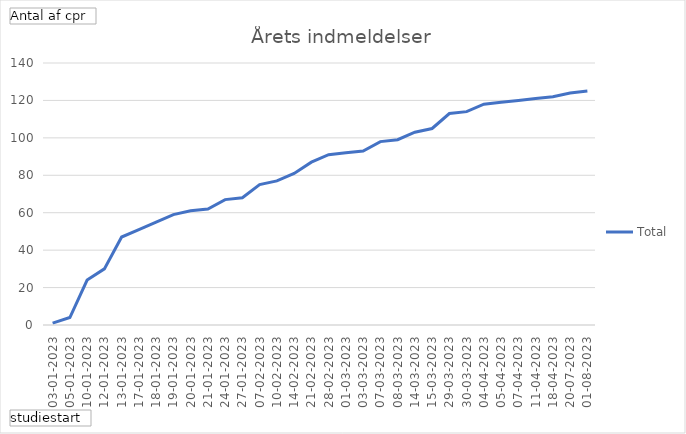
| Category | Total |
|---|---|
| 03-01-2023 | 1 |
| 05-01-2023 | 4 |
| 10-01-2023 | 24 |
| 12-01-2023 | 30 |
| 13-01-2023 | 47 |
| 17-01-2023 | 51 |
| 18-01-2023 | 55 |
| 19-01-2023 | 59 |
| 20-01-2023 | 61 |
| 21-01-2023 | 62 |
| 24-01-2023 | 67 |
| 27-01-2023 | 68 |
| 07-02-2023 | 75 |
| 10-02-2023 | 77 |
| 14-02-2023 | 81 |
| 21-02-2023 | 87 |
| 28-02-2023 | 91 |
| 01-03-2023 | 92 |
| 03-03-2023 | 93 |
| 07-03-2023 | 98 |
| 08-03-2023 | 99 |
| 14-03-2023 | 103 |
| 15-03-2023 | 105 |
| 29-03-2023 | 113 |
| 30-03-2023 | 114 |
| 04-04-2023 | 118 |
| 05-04-2023 | 119 |
| 07-04-2023 | 120 |
| 11-04-2023 | 121 |
| 18-04-2023 | 122 |
| 20-07-2023 | 124 |
| 01-08-2023 | 125 |